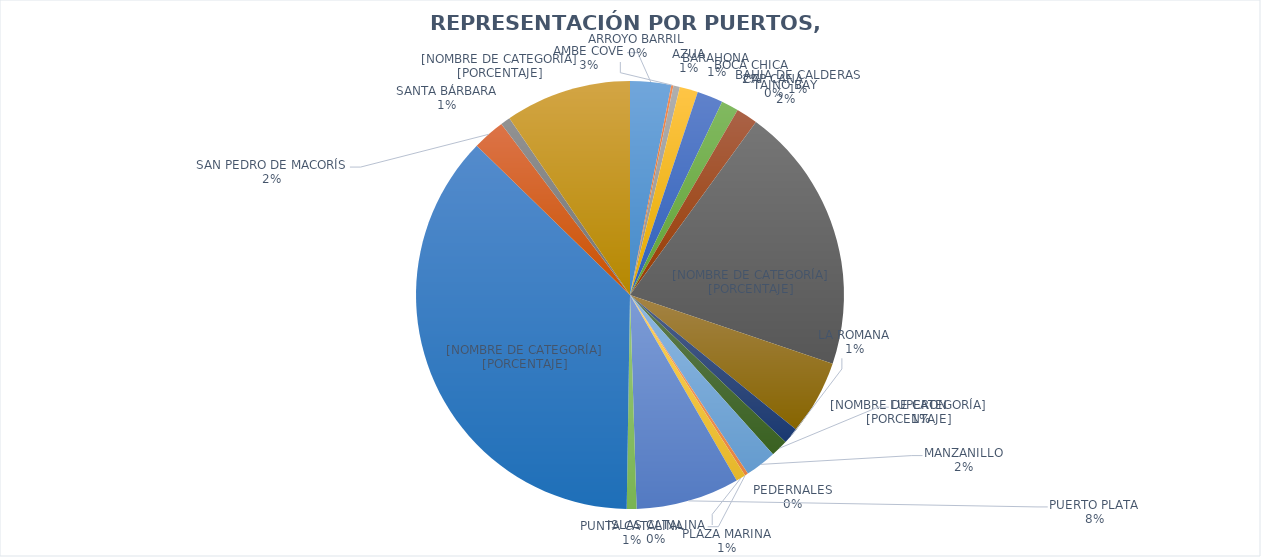
| Category | PORCENTAJE DE REPRESENTACIÓN POR PUERTOS |
|---|---|
| AMBE COVE | 0.031 |
| ARROYO BARRIL | 0.002 |
| AZUA | 0.005 |
| BARAHONA | 0.014 |
| BOCA CHICA | 0.02 |
| BAHIA DE CALDERAS | 0.013 |
| CAP CANA | 0 |
| TAINO BAY | 0.016 |
| CAUCEDO | 0.202 |
| LA CANA | 0.056 |
| LA ROMANA | 0.012 |
| LUPERON  | 0.013 |
| MANZANILLO | 0.024 |
| PEDERNALES | 0.002 |
| ISLAS CATALINA | 0 |
| PLAZA MARINA | 0.007 |
| PUERTO PLATA | 0.078 |
| PUNTA CATALINA | 0.007 |
| RIO HAINA | 0.371 |
| SAN PEDRO DE MACORÍS | 0.024 |
| SANTA BÁRBARA | 0.007 |
| SANTO DOMINGO | 0.095 |